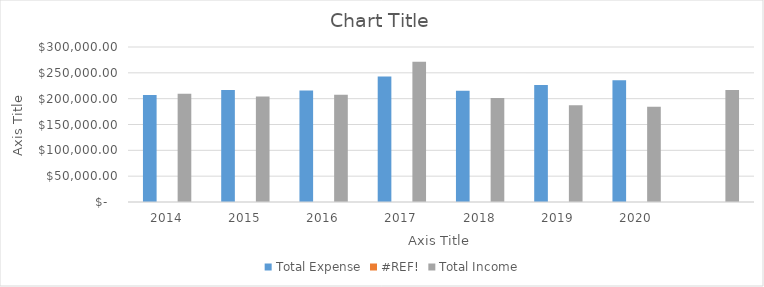
| Category | Total Expense | #REF! | Total Income |
|---|---|---|---|
| 2014.0 | 206980 |  | 209465 |
| 2015.0 | 216854 |  | 204008 |
| 2016.0 | 215963 |  | 207710 |
| 2017.0 | 242918 |  | 271215 |
| 2018.0 | 215250 |  | 201526 |
| 2019.0 | 226518.5 |  | 187452.1 |
| 2020.0 | 235625.05 |  | 184417.31 |